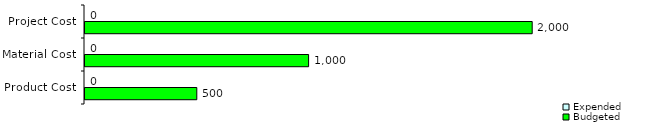
| Category | Budgeted | Expended |
|---|---|---|
| Product Cost | 500 | 0 |
| Material Cost | 1000 | 0 |
| Project Cost | 2000 | 0 |